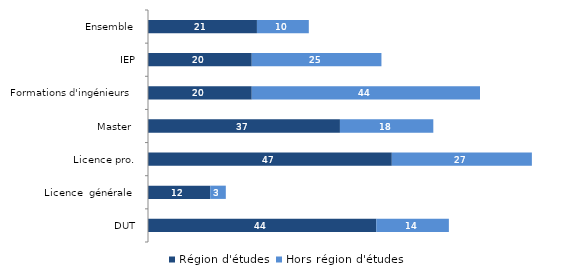
| Category | Région d'études | Hors région d'études |
|---|---|---|
| Ensemble | 21 | 10 |
| IEP | 20 | 25 |
| Formations d'ingénieurs | 20 | 44 |
| Master  | 37 | 18 |
| Licence pro. | 47 | 27 |
| Licence  générale | 12 | 3 |
| DUT | 44 | 14 |